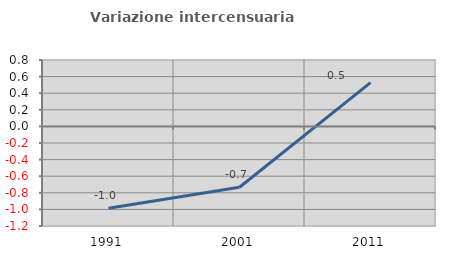
| Category | Variazione intercensuaria annua |
|---|---|
| 1991.0 | -0.987 |
| 2001.0 | -0.733 |
| 2011.0 | 0.527 |